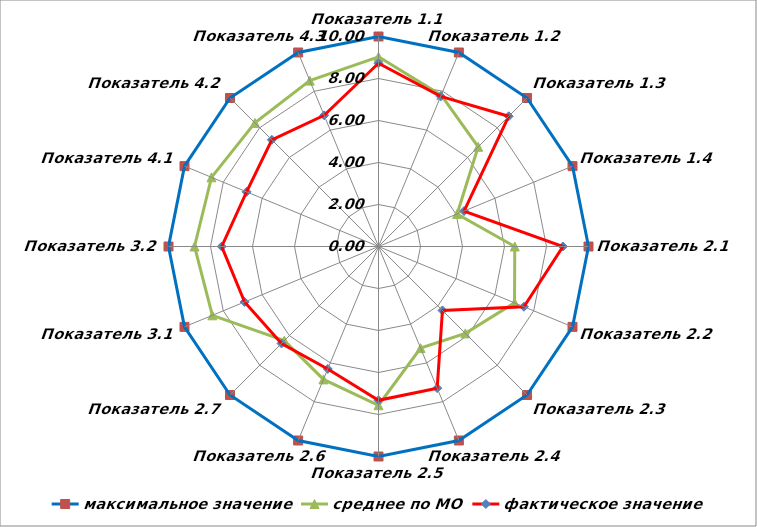
| Category | максимальное значение | среднее по МО | фактическое значение |
|---|---|---|---|
| Показатель 1.1 | 10 | 9.033 | 8.725 |
| Показатель 1.2 | 10 | 7.803 | 7.738 |
| Показатель 1.3 | 10 | 6.713 | 8.771 |
| Показатель 1.4 | 10 | 4.051 | 4.41 |
| Показатель 2.1 | 10 | 6.489 | 8.783 |
| Показатель 2.2 | 10 | 7.011 | 7.495 |
| Показатель 2.3 | 10 | 5.851 | 4.306 |
| Показатель 2.4 | 10 | 5.239 | 7.301 |
| Показатель 2.5 | 10 | 7.56 | 7.323 |
| Показатель 2.6 | 10 | 6.849 | 6.312 |
| Показатель 2.7 | 10 | 6.342 | 6.531 |
| Показатель 3.1 | 10 | 8.563 | 6.901 |
| Показатель 3.2 | 10 | 8.76 | 7.465 |
| Показатель 4.1 | 10 | 8.608 | 6.8 |
| Показатель 4.2 | 10 | 8.323 | 7.183 |
| Показатель 4.3 | 10 | 8.551 | 6.761 |